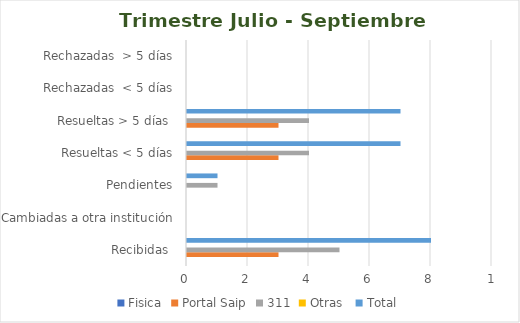
| Category | Fisica | Portal Saip | 311 | Otras  | Total |
|---|---|---|---|---|---|
| Recibidas  | 0 | 3 | 5 | 0 | 8 |
| Cambiadas a otra institución | 0 | 0 | 0 | 0 | 0 |
| Pendientes | 0 | 0 | 1 | 0 | 1 |
| Resueltas < 5 días | 0 | 3 | 4 | 0 | 7 |
| Resueltas > 5 días  | 0 | 3 | 4 | 0 | 7 |
| Rechazadas  < 5 días | 0 | 0 | 0 | 0 | 0 |
| Rechazadas  > 5 días | 0 | 0 | 0 | 0 | 0 |